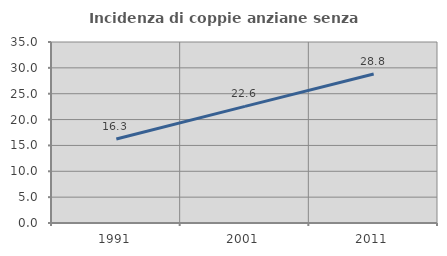
| Category | Incidenza di coppie anziane senza figli  |
|---|---|
| 1991.0 | 16.253 |
| 2001.0 | 22.552 |
| 2011.0 | 28.803 |